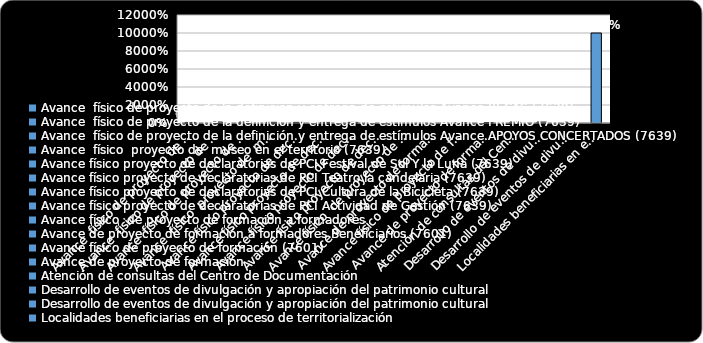
| Category | % Cumplimiento  |
|---|---|
| Avance  físico de proyecto de la definición y entrega de estímulos Avance BECAS (7639) | 0.607 |
| Avance  físico de proyecto de la definición y entrega de estímulos Avance PREMIO (7639) | 1 |
| Avance  físico de proyecto de la definición y entrega de estímulos Avance APOYOS CONCERTADOS (7639) | 1 |
| Avance  físico  proyecto de  museo en el territorio (7639) | 0.738 |
| Avance físico proyecto de declaratorias de PCI Festival de Sol Y la Luna (7639) | 0.716 |
| Avance físico proyecto de declaratorias de PCI Teatro la candelaria (7639) | 0.629 |
| Avance físico proyecto de declaratorias de PCI Cultura de la Bicicleta (7639) | 0.662 |
| Avance físico proyecto de declaratorias de PCI Actividad de Gestión (7639) | 0 |
| Avance físico  de proyecto de formación a formadores   | 0 |
| Avance de proyecto de formación a formadores Beneficiarios (7601) | 0 |
| Avance físico de proyecto de formación (7601) | 0.552 |
| Avance de proyecto de formación   | 0.553 |
| Atención de consultas del Centro de Documentación  | 1 |
| Desarrollo de eventos de divulgación y apropiación del patrimonio cultural | 1 |
| Desarrollo de eventos de divulgación y apropiación del patrimonio cultural | 0.802 |
| Localidades beneficiarias en el proceso de territorialización | 100 |